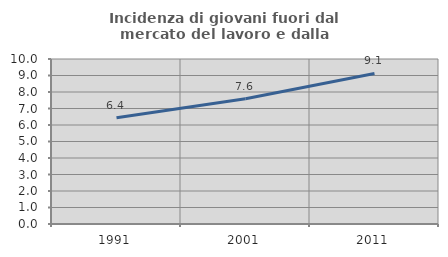
| Category | Incidenza di giovani fuori dal mercato del lavoro e dalla formazione  |
|---|---|
| 1991.0 | 6.435 |
| 2001.0 | 7.596 |
| 2011.0 | 9.125 |